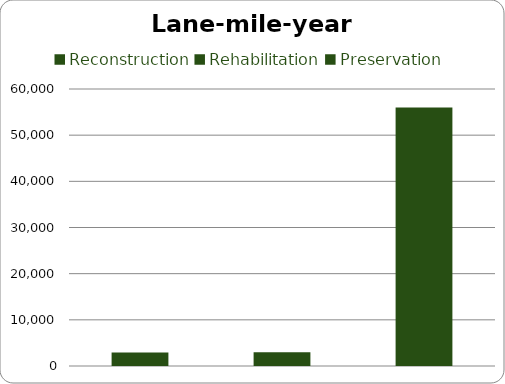
| Category | Series 0 |
|---|---|
| Reconstruction | 2900 |
| Rehabilitation | 3000 |
| Preservation | 56000 |